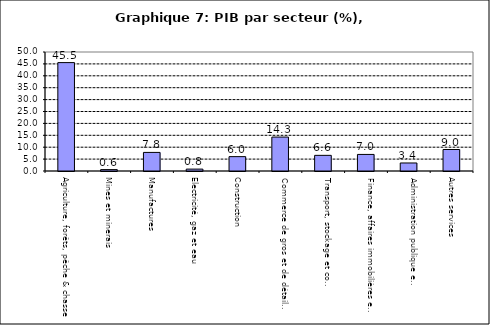
| Category | Series 0 |
|---|---|
| Agriculture, forêts, pêche & chasse | 45.543 |
| Mines et minerais | 0.585 |
| Manufactures | 7.81 |
| Electricité, gaz et eau | 0.796 |
| Construction | 6.037 |
| Commerce de gros et de détail, hôtels et restaurants | 14.257 |
| Transport, stockage et communications                | 6.576 |
| Finance, affaires immobilières et services | 6.965 |
| Administration publique et defense       | 3.373 |
| Autres services                        | 9.027 |